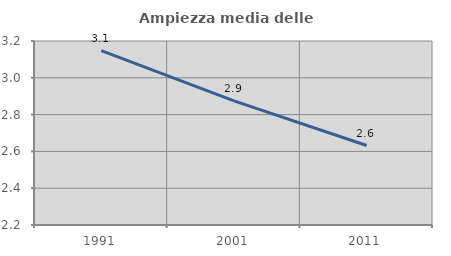
| Category | Ampiezza media delle famiglie |
|---|---|
| 1991.0 | 3.148 |
| 2001.0 | 2.875 |
| 2011.0 | 2.632 |